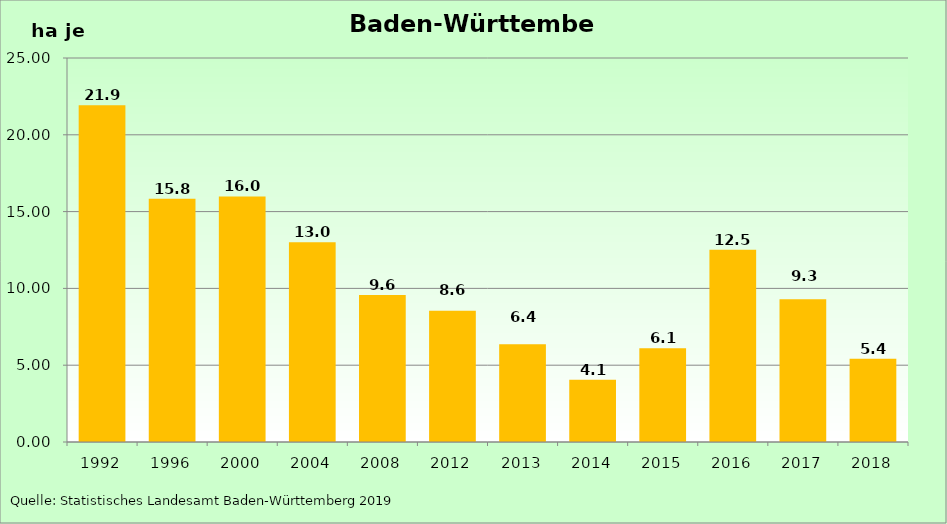
| Category | Landwirtschaftsfläche |
|---|---|
| 1992.0 | 21.93 |
| 1996.0 | 15.83 |
| 2000.0 | 15.99 |
| 2004.0 | 13 |
| 2008.0 | 9.57 |
| 2012.0 | 8.55 |
| 2013.0 | 6.37 |
| 2014.0 | 4.05 |
| 2015.0 | 6.1 |
| 2016.0 | 12.51 |
| 2017.0 | 9.29 |
| 2018.0 | 5.42 |